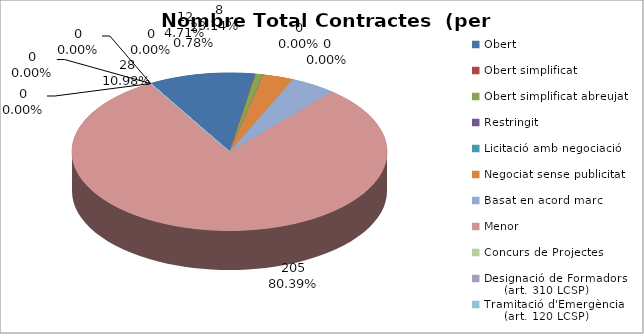
| Category | Nombre Total Contractes |
|---|---|
| Obert | 28 |
| Obert simplificat | 0 |
| Obert simplificat abreujat | 2 |
| Restringit | 0 |
| Licitació amb negociació | 0 |
| Negociat sense publicitat | 8 |
| Basat en acord marc | 12 |
| Menor | 205 |
| Concurs de Projectes | 0 |
| Designació de Formadors
     (art. 310 LCSP) | 0 |
| Tramitació d'Emergència
     (art. 120 LCSP) | 0 |